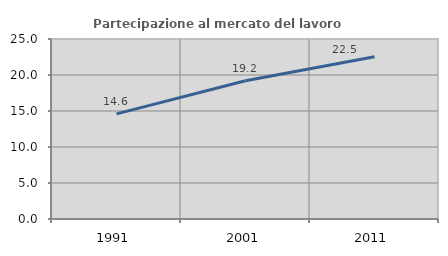
| Category | Partecipazione al mercato del lavoro  femminile |
|---|---|
| 1991.0 | 14.597 |
| 2001.0 | 19.193 |
| 2011.0 | 22.525 |